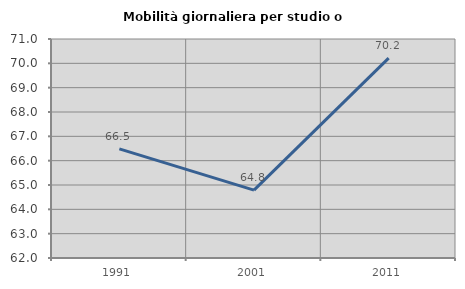
| Category | Mobilità giornaliera per studio o lavoro |
|---|---|
| 1991.0 | 66.483 |
| 2001.0 | 64.787 |
| 2011.0 | 70.216 |